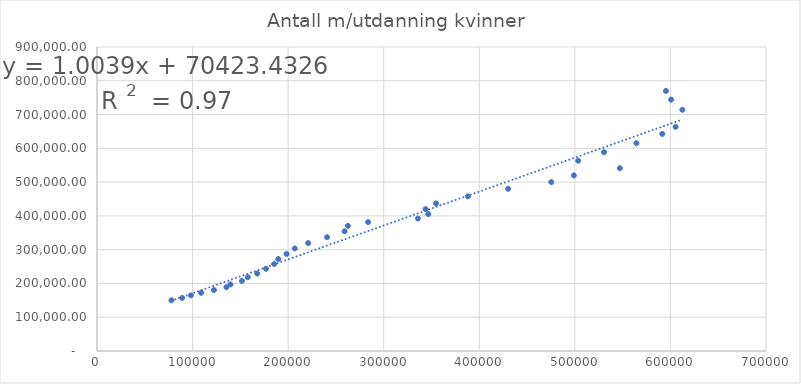
| Category | Antall m/utdanning kvinner  |
|---|---|
| 77895.0 | 150175 |
| 89028.0 | 157068 |
| 98256.0 | 164677 |
| 108929.0 | 172279 |
| 122340.0 | 180549 |
| 135421.0 | 188980 |
| 139648.0 | 197134 |
| 151634.0 | 207595 |
| 157759.0 | 218405 |
| 167649.0 | 229389 |
| 176792.0 | 243376 |
| 185391.0 | 257487 |
| 189691.0 | 272222 |
| 198377.0 | 287448 |
| 206900.0 | 303604 |
| 220941.0 | 319373 |
| 240716.0 | 336905 |
| 259088.0 | 354382 |
| 262485.0 | 370500 |
| 283668.0 | 381610 |
| 335760.0 | 392340 |
| 346626.0 | 405325 |
| 343792.0 | 420039 |
| 354801.0 | 436785 |
| 388070.0 | 457903 |
| 430201.0 | 480118 |
| 475320.0 | 500017 |
| 498999.0 | 519915 |
| 547125.0 | 541251 |
| 503487.0 | 563317 |
| 530498.0 | 588724 |
| 564447.0 | 615228 |
| 591455.0 | 642660 |
| 605408.0 | 663642 |
| 612498.0 | 714166 |
| 600728.0 | 744259 |
| 595291.0 | 769923 |